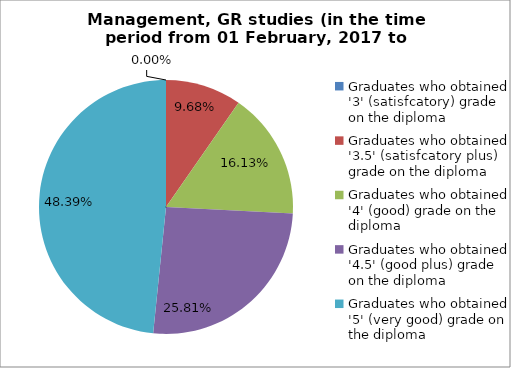
| Category | Series 0 |
|---|---|
| Graduates who obtained '3' (satisfcatory) grade on the diploma | 0 |
| Graduates who obtained '3.5' (satisfcatory plus) grade on the diploma | 9.677 |
| Graduates who obtained '4' (good) grade on the diploma | 16.129 |
| Graduates who obtained '4.5' (good plus) grade on the diploma | 25.806 |
| Graduates who obtained '5' (very good) grade on the diploma | 48.387 |